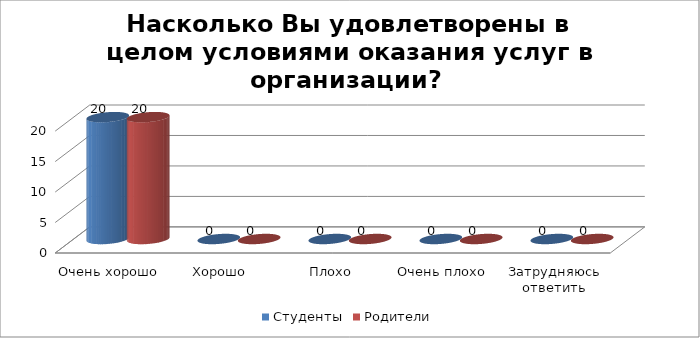
| Category | Студенты | Родители |
|---|---|---|
| Очень хорошо | 20 | 20 |
| Хорошо | 0 | 0 |
| Плохо | 0 | 0 |
| Очень плохо | 0 | 0 |
| Затрудняюсь ответить | 0 | 0 |